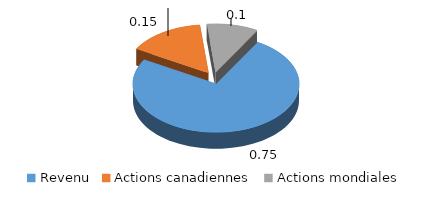
| Category | Series 0 |
|---|---|
| Revenu | 0.75 |
| Actions canadiennes | 0.15 |
| Actions mondiales | 0.1 |